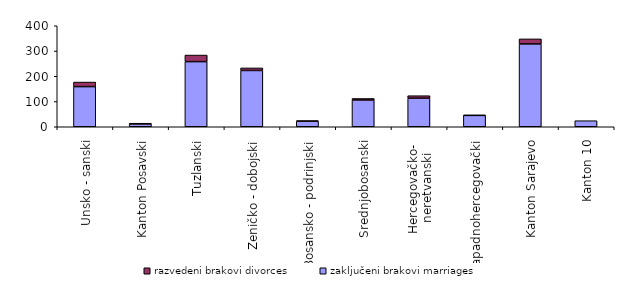
| Category | zaključeni brakovi marriages | razvedeni brakovi divorces |
|---|---|---|
| Unsko - sanski | 159 | 18 |
| Kanton Posavski | 11 | 3 |
| Tuzlanski | 258 | 26 |
| Zeničko - dobojski | 223 | 10 |
| Bosansko - podrinjski | 22 | 2 |
| Srednjobosanski | 106 | 6 |
| Hercegovačko- 
neretvanski | 113 | 10 |
| Zapadnohercegovački | 45 | 1 |
| Kanton Sarajevo | 328 | 20 |
| Kanton 10 | 24 | 0 |